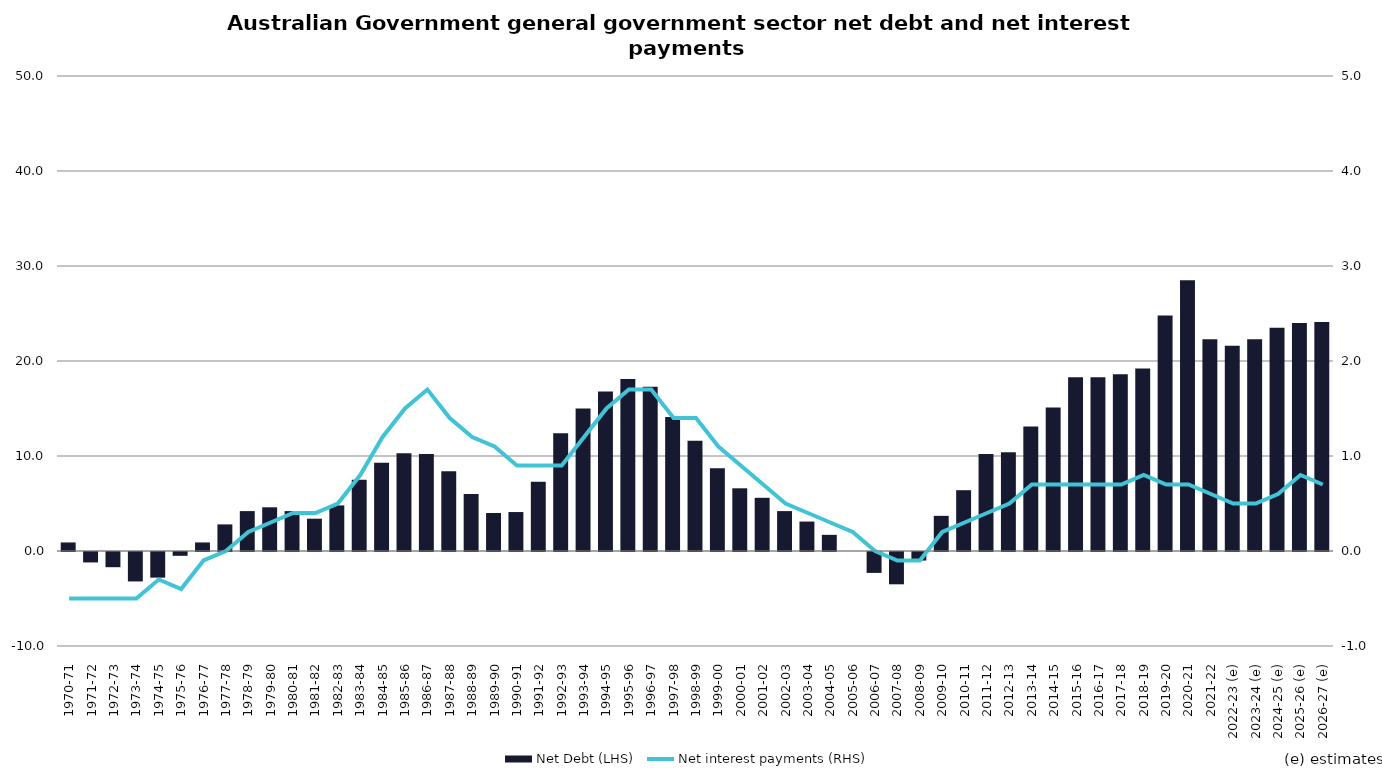
| Category | Net Debt (LHS) |
|---|---|
| 1970-71 | 0.9 |
| 1971-72 | -1.1 |
| 1972-73 | -1.6 |
| 1973-74 | -3.1 |
| 1974-75 | -2.7 |
| 1975-76 | -0.4 |
| 1976-77 | 0.9 |
| 1977-78 | 2.8 |
| 1978-79 | 4.2 |
| 1979-80 | 4.6 |
| 1980-81 | 4.2 |
| 1981-82 | 3.4 |
| 1982-83 | 4.8 |
| 1983-84 | 7.5 |
| 1984-85 | 9.3 |
| 1985-86 | 10.3 |
| 1986-87 | 10.2 |
| 1987-88 | 8.4 |
| 1988-89 | 6 |
| 1989-90 | 4 |
| 1990-91 | 4.1 |
| 1991-92 | 7.3 |
| 1992-93 | 12.4 |
| 1993-94 | 15 |
| 1994-95 | 16.8 |
| 1995-96 | 18.1 |
| 1996-97 | 17.3 |
| 1997-98 | 14.1 |
| 1998-99 | 11.6 |
| 1999-00 | 8.7 |
| 2000-01 | 6.6 |
| 2001-02 | 5.6 |
| 2002-03 | 4.2 |
| 2003-04 | 3.1 |
| 2004-05 | 1.7 |
| 2005-06 | 0 |
| 2006-07 | -2.2 |
| 2007-08 | -3.4 |
| 2008-09 | -0.9 |
| 2009-10 | 3.7 |
| 2010-11 | 6.4 |
| 2011-12 | 10.2 |
| 2012-13 | 10.4 |
| 2013-14 | 13.1 |
| 2014-15 | 15.1 |
| 2015-16 | 18.3 |
| 2016-17 | 18.3 |
| 2017-18 | 18.6 |
| 2018-19 | 19.2 |
| 2019-20 | 24.8 |
| 2020-21 | 28.5 |
| 2021-22 | 22.3 |
| 2022-23 (e) | 21.6 |
| 2023-24 (e) | 22.3 |
| 2024-25 (e) | 23.5 |
| 2025-26 (e) | 24 |
| 2026-27 (e) | 24.1 |